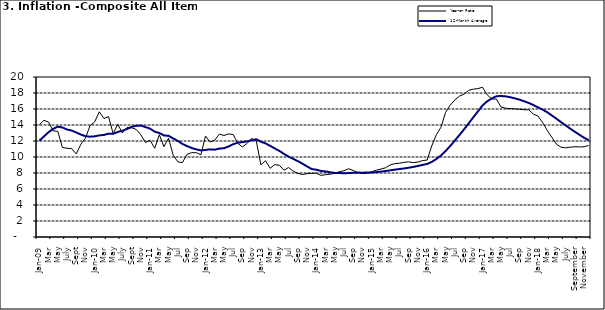
| Category | Year-on Rate | 12-Month Average |
|---|---|---|
| Jan-09 | 14.034 | 12.032 |
| Feb | 14.584 | 12.567 |
| Mar | 14.366 | 13.101 |
| Apr | 13.268 | 13.51 |
| May | 13.212 | 13.787 |
| June | 11.194 | 13.694 |
| July | 11.09 | 13.437 |
| Aug | 11.046 | 13.307 |
| Sept | 10.39 | 13.065 |
| Oct | 11.588 | 12.803 |
| Nov | 12.368 | 12.609 |
| Dec | 13.93 | 12.538 |
| Jan-10 | 14.398 | 12.586 |
| Feb | 15.649 | 12.7 |
| Mar | 14.812 | 12.757 |
| Apr | 15.044 | 12.915 |
| May | 12.915 | 12.893 |
| June | 14.099 | 13.132 |
| July | 13.002 | 13.284 |
| Aug | 13.702 | 13.5 |
| Sept | 13.65 | 13.764 |
| Oct | 13.45 | 13.908 |
| Nov | 12.766 | 13.928 |
| Dec | 11.815 | 13.74 |
| Jan-11 | 12.08 | 13.542 |
| Feb | 11.1 | 13.161 |
| Mar | 12.779 | 13.001 |
| Apr | 11.291 | 12.694 |
| May | 12.352 | 12.648 |
| Jun | 10.23 | 12.321 |
| Jul | 9.397 | 12.009 |
| Aug | 9.301 | 11.635 |
| Sep | 10.339 | 11.363 |
| Oct | 10.544 | 11.13 |
| Nov | 10.54 | 10.952 |
| Dec | 10.283 | 10.826 |
| Jan-12 | 12.626 | 10.886 |
| Feb | 11.866 | 10.955 |
| Mar | 12.111 | 10.914 |
| Apr | 12.866 | 11.054 |
| May | 12.688 | 11.096 |
| Jun | 12.892 | 11.32 |
| Jul | 12.797 | 11.599 |
| Aug | 11.689 | 11.791 |
| Sep | 11.253 | 11.859 |
| Oct | 11.693 | 11.948 |
| Nov | 12.32 | 12.091 |
| Dec | 11.981 | 12.224 |
| Jan-13 | 9.031 | 11.908 |
| Feb | 9.542 | 11.703 |
| Mar | 8.593 | 11.394 |
| Apr | 9.052 | 11.072 |
| May | 8.964 | 10.761 |
| Jun | 8.353 | 10.383 |
| Jul | 8.682 | 10.047 |
| Aug | 8.231 | 9.761 |
| Sep | 7.952 | 9.486 |
| Oct | 7.807 | 9.167 |
| Nov | 7.931 | 8.815 |
| Dec | 7.957 | 8.496 |
| Jan-14 | 7.977 | 8.408 |
| Feb | 7.707 | 8.257 |
| Mar | 7.783 | 8.19 |
| Apr | 7.851 | 8.092 |
| May | 7.965 | 8.012 |
| Jun | 8.167 | 7.998 |
| Jul | 8.281 | 7.968 |
| Aug | 8.534 | 7.996 |
| Sep | 8.317 | 8.027 |
| Oct | 8.06 | 8.047 |
| Nov | 7.927 | 8.046 |
| Dec | 7.978 | 8.047 |
| Jan-15 | 8.157 | 8.063 |
| Feb | 8.359 | 8.117 |
| Mar | 8.494 | 8.176 |
| Apr | 8.655 | 8.243 |
| May | 9.003 | 8.331 |
| Jun | 9.168 | 8.417 |
| Jul | 9.218 | 8.497 |
| Aug | 9.336 | 8.566 |
| Sep | 9.394 | 8.658 |
| Oct | 9.296 | 8.76 |
| Nov | 9.368 | 8.879 |
| Dec | 9.554 | 9.009 |
| Jan-16 | 9.617 | 9.13 |
| Feb | 11.379 | 9.386 |
| Mar | 12.775 | 9.751 |
| Apr | 13.721 | 10.182 |
| May | 15.577 | 10.746 |
| Jun | 16.48 | 11.372 |
| Jul | 17.127 | 12.045 |
| Aug | 17.609 | 12.744 |
| Sep | 17.852 | 13.454 |
| Oct | 18.33 | 14.206 |
| Nov | 18.476 | 14.958 |
| Dec | 18.547 | 15.697 |
| Jan-17 | 18.719 | 16.441 |
| Feb | 17.78 | 16.958 |
| Mar | 17.256 | 17.315 |
| Apr | 17.244 | 17.591 |
| May | 16.251 | 17.628 |
| Jun | 16.098 | 17.578 |
| Jul | 16.053 | 17.475 |
| Aug | 16.012 | 17.331 |
| Sep | 15.979 | 17.17 |
| Oct | 15.905 | 16.968 |
| Nov | 15.901 | 16.76 |
| Dec | 15.372 | 16.502 |
| Jan-18 | 15.127 | 16.215 |
| Feb | 14.33 | 15.93 |
| Mar | 13.337 | 15.599 |
| Apr | 12.482 | 15.196 |
| May | 11.608 | 14.793 |
| June | 11.231 | 14.371 |
| July | 11.142 | 13.95 |
| August | 11.227 | 13.546 |
| September | 11.284 | 13.157 |
| October | 11.259 | 12.777 |
| November | 11.281 | 12.406 |
| December | 11.442 | 12.095 |